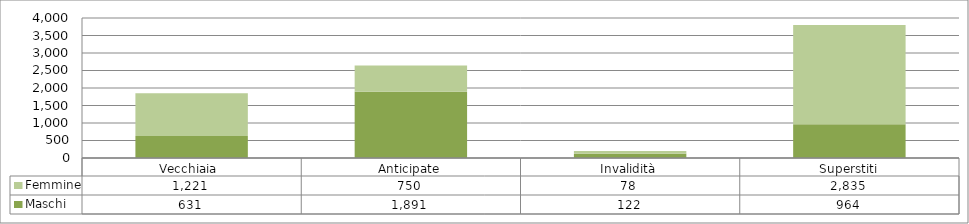
| Category | Maschi | Femmine |
|---|---|---|
| Vecchiaia  | 631 | 1221 |
| Anticipate | 1891 | 750 |
| Invalidità | 122 | 78 |
| Superstiti | 964 | 2835 |